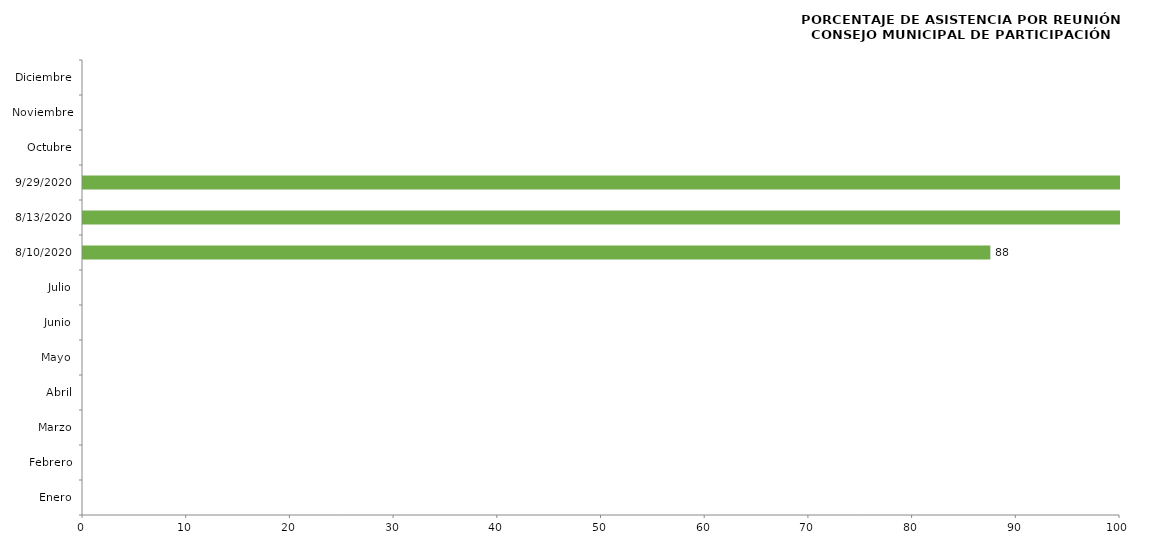
| Category | Series 0 |
|---|---|
| Enero | 0 |
| Febrero | 0 |
| Marzo | 0 |
| Abril | 0 |
| Mayo | 0 |
| Junio | 0 |
| Julio | 0 |
| 10/08/2020 | 87.5 |
| 13/08/2020 | 100 |
| 29/09/2020 | 100 |
| Octubre | 0 |
| Noviembre | 0 |
| Diciembre | 0 |